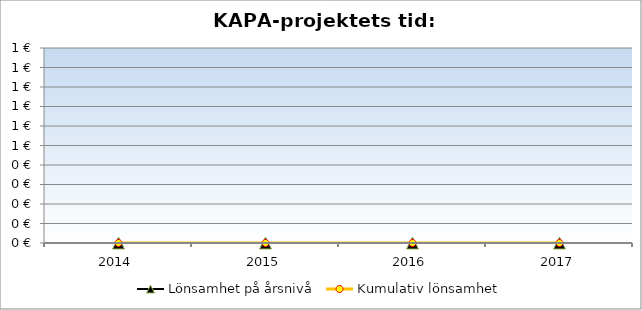
| Category | Lönsamhet på årsnivå | Kumulativ lönsamhet |
|---|---|---|
| 2014.0 | 0 | 0 |
| 2015.0 | 0 | 0 |
| 2016.0 | 0 | 0 |
| 2017.0 | 0 | 0 |